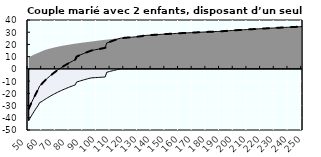
| Category | Coin fiscal moyen (somme des composantes) | Taux moyen d'imposition net en % du salaire brut |
|---|---|---|
| 50.0 | -32.741 | -32.741 |
| 51.0 | -30.256 | -30.256 |
| 52.0 | -27.767 | -27.767 |
| 53.0 | -25.371 | -25.371 |
| 54.0 | -23.064 | -23.064 |
| 55.0 | -20.841 | -20.841 |
| 56.0 | -18.698 | -18.698 |
| 57.0 | -16.629 | -16.629 |
| 58.0 | -13.947 | -13.947 |
| 59.0 | -12.964 | -12.964 |
| 60.0 | -11.778 | -11.778 |
| 61.0 | -10.536 | -10.536 |
| 62.0 | -9.388 | -9.388 |
| 63.0 | -8.351 | -8.351 |
| 64.0 | -7.345 | -7.345 |
| 65.0 | -6.371 | -6.371 |
| 66.0 | -5.426 | -5.426 |
| 67.0 | -4.509 | -4.509 |
| 68.0 | -3.619 | -3.619 |
| 69.0 | -2.755 | -2.755 |
| 70.0 | -1.916 | -1.916 |
| 71.0 | -1.112 | -1.112 |
| 72.0 | -0.34 | -0.34 |
| 73.0 | 0.411 | 0.411 |
| 74.0 | 1.142 | 1.142 |
| 75.0 | 1.854 | 1.854 |
| 76.0 | 2.546 | 2.546 |
| 77.0 | 3.221 | 3.221 |
| 78.0 | 3.879 | 3.879 |
| 79.0 | 4.519 | 4.519 |
| 80.0 | 5.144 | 5.144 |
| 81.0 | 5.753 | 5.753 |
| 82.0 | 6.348 | 6.348 |
| 83.0 | 6.928 | 6.928 |
| 84.0 | 7.494 | 7.494 |
| 85.0 | 10.007 | 10.007 |
| 86.0 | 10.524 | 10.524 |
| 87.0 | 11.029 | 11.029 |
| 88.0 | 11.523 | 11.523 |
| 89.0 | 12.006 | 12.006 |
| 90.0 | 12.478 | 12.478 |
| 91.0 | 12.94 | 12.94 |
| 92.0 | 13.392 | 13.392 |
| 93.0 | 13.834 | 13.834 |
| 94.0 | 14.267 | 14.267 |
| 95.0 | 14.69 | 14.69 |
| 96.0 | 15.051 | 15.051 |
| 97.0 | 15.283 | 15.283 |
| 98.0 | 15.51 | 15.51 |
| 99.0 | 15.732 | 15.732 |
| 100.0 | 15.949 | 15.949 |
| 101.0 | 16.163 | 16.163 |
| 102.0 | 16.372 | 16.372 |
| 103.0 | 16.577 | 16.577 |
| 104.0 | 16.778 | 16.778 |
| 105.0 | 16.976 | 16.976 |
| 106.0 | 17.319 | 17.319 |
| 107.0 | 21.139 | 21.139 |
| 108.0 | 21.568 | 21.568 |
| 109.0 | 21.989 | 21.989 |
| 110.0 | 22.403 | 22.403 |
| 111.0 | 22.809 | 22.809 |
| 112.0 | 23.208 | 23.208 |
| 113.0 | 23.6 | 23.6 |
| 114.0 | 23.985 | 23.985 |
| 115.0 | 24.364 | 24.364 |
| 116.0 | 24.736 | 24.736 |
| 117.0 | 25.101 | 25.101 |
| 118.0 | 25.209 | 25.209 |
| 119.0 | 25.312 | 25.312 |
| 120.0 | 25.413 | 25.413 |
| 121.0 | 25.513 | 25.513 |
| 122.0 | 25.612 | 25.612 |
| 123.0 | 25.708 | 25.708 |
| 124.0 | 25.803 | 25.803 |
| 125.0 | 25.897 | 25.897 |
| 126.0 | 25.989 | 25.989 |
| 127.0 | 26.089 | 26.089 |
| 128.0 | 26.213 | 26.213 |
| 129.0 | 26.336 | 26.336 |
| 130.0 | 26.456 | 26.456 |
| 131.0 | 26.575 | 26.575 |
| 132.0 | 26.692 | 26.692 |
| 133.0 | 26.807 | 26.807 |
| 134.0 | 27.23 | 27.23 |
| 135.0 | 27.318 | 27.318 |
| 136.0 | 27.403 | 27.403 |
| 137.0 | 27.488 | 27.488 |
| 138.0 | 27.572 | 27.572 |
| 139.0 | 27.654 | 27.654 |
| 140.0 | 27.735 | 27.735 |
| 141.0 | 27.815 | 27.815 |
| 142.0 | 27.893 | 27.893 |
| 143.0 | 27.971 | 27.971 |
| 144.0 | 28.048 | 28.048 |
| 145.0 | 28.123 | 28.123 |
| 146.0 | 28.198 | 28.198 |
| 147.0 | 28.271 | 28.271 |
| 148.0 | 28.344 | 28.344 |
| 149.0 | 28.415 | 28.415 |
| 150.0 | 28.486 | 28.486 |
| 151.0 | 28.555 | 28.555 |
| 152.0 | 28.624 | 28.624 |
| 153.0 | 28.692 | 28.692 |
| 154.0 | 28.759 | 28.759 |
| 155.0 | 28.825 | 28.825 |
| 156.0 | 28.89 | 28.89 |
| 157.0 | 28.955 | 28.955 |
| 158.0 | 29.018 | 29.018 |
| 159.0 | 29.081 | 29.081 |
| 160.0 | 29.143 | 29.143 |
| 161.0 | 29.204 | 29.204 |
| 162.0 | 29.265 | 29.265 |
| 163.0 | 29.324 | 29.324 |
| 164.0 | 29.383 | 29.383 |
| 165.0 | 29.442 | 29.442 |
| 166.0 | 29.499 | 29.499 |
| 167.0 | 29.556 | 29.556 |
| 168.0 | 29.612 | 29.612 |
| 169.0 | 29.668 | 29.668 |
| 170.0 | 29.723 | 29.723 |
| 171.0 | 29.777 | 29.777 |
| 172.0 | 29.831 | 29.831 |
| 173.0 | 29.884 | 29.884 |
| 174.0 | 29.936 | 29.936 |
| 175.0 | 29.988 | 29.988 |
| 176.0 | 30.039 | 30.039 |
| 177.0 | 30.09 | 30.09 |
| 178.0 | 30.14 | 30.14 |
| 179.0 | 30.189 | 30.189 |
| 180.0 | 30.238 | 30.238 |
| 181.0 | 30.287 | 30.287 |
| 182.0 | 30.334 | 30.334 |
| 183.0 | 30.382 | 30.382 |
| 184.0 | 30.429 | 30.429 |
| 185.0 | 30.475 | 30.475 |
| 186.0 | 30.521 | 30.521 |
| 187.0 | 30.566 | 30.566 |
| 188.0 | 30.611 | 30.611 |
| 189.0 | 30.655 | 30.655 |
| 190.0 | 30.699 | 30.699 |
| 191.0 | 30.78 | 30.78 |
| 192.0 | 30.865 | 30.865 |
| 193.0 | 30.948 | 30.948 |
| 194.0 | 31.031 | 31.031 |
| 195.0 | 31.113 | 31.113 |
| 196.0 | 31.194 | 31.194 |
| 197.0 | 31.274 | 31.274 |
| 198.0 | 31.354 | 31.354 |
| 199.0 | 31.432 | 31.432 |
| 200.0 | 31.51 | 31.51 |
| 201.0 | 31.587 | 31.587 |
| 202.0 | 31.664 | 31.664 |
| 203.0 | 31.739 | 31.739 |
| 204.0 | 31.814 | 31.814 |
| 205.0 | 31.888 | 31.888 |
| 206.0 | 31.961 | 31.961 |
| 207.0 | 32.034 | 32.034 |
| 208.0 | 32.106 | 32.106 |
| 209.0 | 32.177 | 32.177 |
| 210.0 | 32.248 | 32.248 |
| 211.0 | 32.318 | 32.318 |
| 212.0 | 32.387 | 32.387 |
| 213.0 | 32.456 | 32.456 |
| 214.0 | 32.524 | 32.524 |
| 215.0 | 32.591 | 32.591 |
| 216.0 | 32.658 | 32.658 |
| 217.0 | 32.724 | 32.724 |
| 218.0 | 32.789 | 32.789 |
| 219.0 | 32.854 | 32.854 |
| 220.0 | 32.918 | 32.918 |
| 221.0 | 32.982 | 32.982 |
| 222.0 | 33.045 | 33.045 |
| 223.0 | 33.108 | 33.108 |
| 224.0 | 33.17 | 33.17 |
| 225.0 | 33.231 | 33.231 |
| 226.0 | 33.292 | 33.292 |
| 227.0 | 33.353 | 33.353 |
| 228.0 | 33.412 | 33.412 |
| 229.0 | 33.472 | 33.472 |
| 230.0 | 33.531 | 33.531 |
| 231.0 | 33.589 | 33.589 |
| 232.0 | 33.647 | 33.647 |
| 233.0 | 33.704 | 33.704 |
| 234.0 | 33.761 | 33.761 |
| 235.0 | 33.817 | 33.817 |
| 236.0 | 33.873 | 33.873 |
| 237.0 | 33.928 | 33.928 |
| 238.0 | 33.983 | 33.983 |
| 239.0 | 34.038 | 34.038 |
| 240.0 | 34.092 | 34.092 |
| 241.0 | 34.145 | 34.145 |
| 242.0 | 34.198 | 34.198 |
| 243.0 | 34.251 | 34.251 |
| 244.0 | 34.303 | 34.303 |
| 245.0 | 34.355 | 34.355 |
| 246.0 | 34.407 | 34.407 |
| 247.0 | 34.458 | 34.458 |
| 248.0 | 34.508 | 34.508 |
| 249.0 | 34.558 | 34.558 |
| 250.0 | 34.608 | 34.608 |